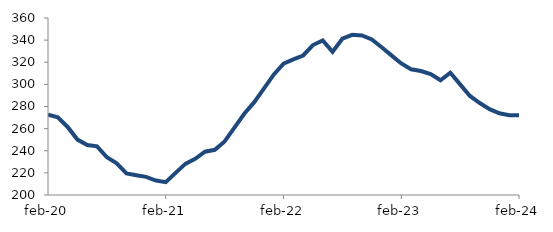
| Category | Series 0 |
|---|---|
| 2020-02-01 | 272.678 |
| 2020-03-01 | 270.182 |
| 2020-04-01 | 261.514 |
| 2020-05-01 | 250.092 |
| 2020-06-01 | 245.154 |
| 2020-07-01 | 243.995 |
| 2020-08-01 | 234.063 |
| 2020-09-01 | 228.636 |
| 2020-10-01 | 219.498 |
| 2020-11-01 | 217.84 |
| 2020-12-01 | 216.368 |
| 2021-01-01 | 213.087 |
| 2021-02-01 | 211.643 |
| 2021-03-01 | 220.04 |
| 2021-04-01 | 228.12 |
| 2021-05-01 | 232.717 |
| 2021-06-01 | 239.097 |
| 2021-07-01 | 240.846 |
| 2021-08-01 | 248.449 |
| 2021-09-01 | 260.934 |
| 2021-10-01 | 273.441 |
| 2021-11-01 | 283.683 |
| 2021-12-01 | 296.134 |
| 2022-01-01 | 308.804 |
| 2022-02-01 | 318.726 |
| 2022-03-01 | 322.592 |
| 2022-04-01 | 326.114 |
| 2022-05-01 | 335.557 |
| 2022-06-01 | 339.684 |
| 2022-07-01 | 329.357 |
| 2022-08-01 | 341.293 |
| 2022-09-01 | 344.793 |
| 2022-10-01 | 344.185 |
| 2022-11-01 | 340.608 |
| 2022-12-01 | 333.559 |
| 2023-01-01 | 326.199 |
| 2023-02-01 | 318.915 |
| 2023-03-01 | 313.615 |
| 2023-04-01 | 312.076 |
| 2023-05-01 | 309.232 |
| 2023-06-01 | 303.714 |
| 2023-07-01 | 310.493 |
| 2023-08-01 | 299.987 |
| 2023-09-01 | 289.543 |
| 2023-10-01 | 283.093 |
| 2023-11-01 | 277.645 |
| 2023-12-01 | 273.863 |
| 2024-01-01 | 272.122 |
| 2024-02-01 | 272.092 |